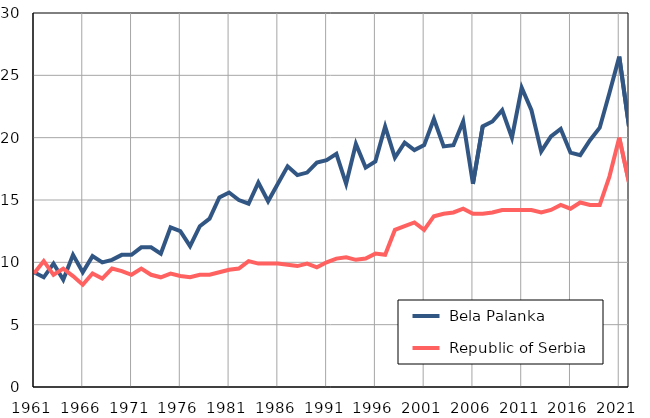
| Category |  Bela Palanka |  Republic of Serbia |
|---|---|---|
| 1961.0 | 9.2 | 9.1 |
| 1962.0 | 8.8 | 10.1 |
| 1963.0 | 9.9 | 9 |
| 1964.0 | 8.6 | 9.5 |
| 1965.0 | 10.6 | 8.9 |
| 1966.0 | 9.2 | 8.2 |
| 1967.0 | 10.5 | 9.1 |
| 1968.0 | 10 | 8.7 |
| 1969.0 | 10.2 | 9.5 |
| 1970.0 | 10.6 | 9.3 |
| 1971.0 | 10.6 | 9 |
| 1972.0 | 11.2 | 9.5 |
| 1973.0 | 11.2 | 9 |
| 1974.0 | 10.7 | 8.8 |
| 1975.0 | 12.8 | 9.1 |
| 1976.0 | 12.5 | 8.9 |
| 1977.0 | 11.3 | 8.8 |
| 1978.0 | 12.9 | 9 |
| 1979.0 | 13.5 | 9 |
| 1980.0 | 15.2 | 9.2 |
| 1981.0 | 15.6 | 9.4 |
| 1982.0 | 15 | 9.5 |
| 1983.0 | 14.7 | 10.1 |
| 1984.0 | 16.4 | 9.9 |
| 1985.0 | 14.9 | 9.9 |
| 1986.0 | 16.3 | 9.9 |
| 1987.0 | 17.7 | 9.8 |
| 1988.0 | 17 | 9.7 |
| 1989.0 | 17.2 | 9.9 |
| 1990.0 | 18 | 9.6 |
| 1991.0 | 18.2 | 10 |
| 1992.0 | 18.7 | 10.3 |
| 1993.0 | 16.3 | 10.4 |
| 1994.0 | 19.5 | 10.2 |
| 1995.0 | 17.6 | 10.3 |
| 1996.0 | 18.1 | 10.7 |
| 1997.0 | 20.9 | 10.6 |
| 1998.0 | 18.4 | 12.6 |
| 1999.0 | 19.6 | 12.9 |
| 2000.0 | 19 | 13.2 |
| 2001.0 | 19.4 | 12.6 |
| 2002.0 | 21.5 | 13.7 |
| 2003.0 | 19.3 | 13.9 |
| 2004.0 | 19.4 | 14 |
| 2005.0 | 21.3 | 14.3 |
| 2006.0 | 16.3 | 13.9 |
| 2007.0 | 20.9 | 13.9 |
| 2008.0 | 21.3 | 14 |
| 2009.0 | 22.2 | 14.2 |
| 2010.0 | 20 | 14.2 |
| 2011.0 | 24 | 14.2 |
| 2012.0 | 22.2 | 14.2 |
| 2013.0 | 18.9 | 14 |
| 2014.0 | 20.1 | 14.2 |
| 2015.0 | 20.7 | 14.6 |
| 2016.0 | 18.8 | 14.3 |
| 2017.0 | 18.6 | 14.8 |
| 2018.0 | 19.8 | 14.6 |
| 2019.0 | 20.8 | 14.6 |
| 2020.0 | 23.6 | 16.9 |
| 2021.0 | 26.5 | 20 |
| 2022.0 | 20.9 | 16.4 |